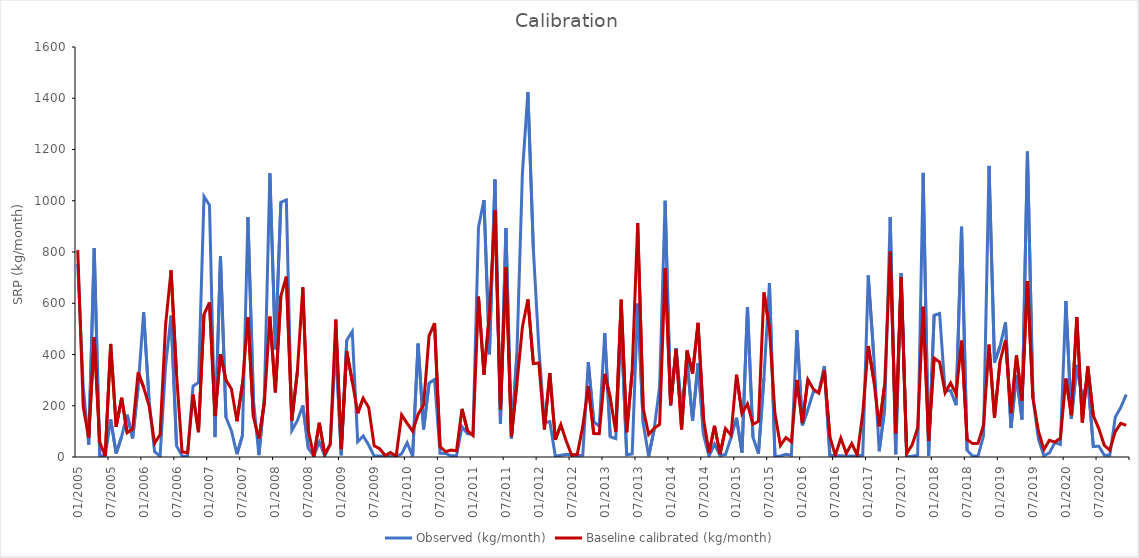
| Category | Observed (kg/month) | Baseline calibrated (kg/month) |
|---|---|---|
| 2005-01-01 | 753.418 | 807.2 |
| 2005-02-01 | 274.582 | 195.3 |
| 2005-03-01 | 48.433 | 75.92 |
| 2005-04-01 | 814.747 | 467.1 |
| 2005-05-01 | 5.586 | 59.03 |
| 2005-06-01 | 4.75 | 4.256 |
| 2005-07-01 | 146.586 | 441.1 |
| 2005-08-01 | 13.657 | 117.8 |
| 2005-09-01 | 80.189 | 230.9 |
| 2005-10-01 | 165.116 | 94.71 |
| 2005-11-01 | 72.857 | 109.1 |
| 2005-12-01 | 272.198 | 330.4 |
| 2006-01-01 | 564.193 | 272 |
| 2006-02-01 | 219.671 | 199.1 |
| 2006-03-01 | 20.928 | 53.64 |
| 2006-04-01 | 3.38 | 87.61 |
| 2006-05-01 | 354.306 | 514.8 |
| 2006-06-01 | 551.727 | 728.5 |
| 2006-07-01 | 43.36 | 320.9 |
| 2006-08-01 | 5.076 | 20.56 |
| 2006-09-01 | 2.96 | 16.75 |
| 2006-10-01 | 276.41 | 243.1 |
| 2006-11-01 | 291.066 | 96.9 |
| 2006-12-01 | 1016.955 | 556.8 |
| 2007-01-01 | 982.65 | 603.1 |
| 2007-02-01 | 77.711 | 159.9 |
| 2007-03-01 | 783.538 | 401.5 |
| 2007-04-01 | 155.234 | 300.7 |
| 2007-05-01 | 102.01 | 265.2 |
| 2007-06-01 | 10.898 | 139.7 |
| 2007-07-01 | 83.407 | 285.6 |
| 2007-08-01 | 936.771 | 546.1 |
| 2007-09-01 | 222.943 | 156 |
| 2007-10-01 | 7.339 | 72.15 |
| 2007-11-01 | 233.2 | 212.2 |
| 2007-12-01 | 1106.851 | 548.2 |
| 2008-01-01 | 420.581 | 252 |
| 2008-02-01 | 994.323 | 628 |
| 2008-03-01 | 1002.733 | 703.9 |
| 2008-04-01 | 103.476 | 142.6 |
| 2008-05-01 | 141.861 | 331.7 |
| 2008-06-01 | 201.143 | 662.1 |
| 2008-07-01 | 33.931 | 103 |
| 2008-08-01 | 2.884 | 3.027 |
| 2008-09-01 | 58.407 | 133.3 |
| 2008-10-01 | 3.25 | 10.74 |
| 2008-11-01 | 52.517 | 48.72 |
| 2008-12-01 | 433.378 | 536.3 |
| 2009-01-01 | 6.941 | 30.63 |
| 2009-02-01 | 455.413 | 412.2 |
| 2009-03-01 | 489.569 | 295.3 |
| 2009-04-01 | 59.773 | 170.4 |
| 2009-05-01 | 82.105 | 229.5 |
| 2009-06-01 | 46.746 | 192.8 |
| 2009-07-01 | 3.439 | 43.92 |
| 2009-08-01 | 4.269 | 32.25 |
| 2009-09-01 | 2.469 | 5.699 |
| 2009-10-01 | 3.131 | 17.43 |
| 2009-11-01 | 2.093 | 2.745 |
| 2009-12-01 | 11.942 | 164.2 |
| 2010-01-01 | 55.731 | 131.1 |
| 2010-02-01 | 2.968 | 100.9 |
| 2010-03-01 | 442.31 | 166.1 |
| 2010-04-01 | 107.638 | 203.9 |
| 2010-05-01 | 287.966 | 472.6 |
| 2010-06-01 | 302.528 | 522.2 |
| 2010-07-01 | 14.729 | 40.54 |
| 2010-08-01 | 14.105 | 20.78 |
| 2010-09-01 | 4.484 | 27.14 |
| 2010-10-01 | 4.926 | 24.54 |
| 2010-11-01 | 117.814 | 187.9 |
| 2010-12-01 | 90.645 | 102.9 |
| 2011-01-01 | 90.034 | 83.78 |
| 2011-02-01 | 897.176 | 625.5 |
| 2011-03-01 | 1003.138 | 321.6 |
| 2011-04-01 | 401.111 | 560.1 |
| 2011-05-01 | 1082.677 | 962.4 |
| 2011-06-01 | 130.043 | 184.9 |
| 2011-07-01 | 892.493 | 741.6 |
| 2011-08-01 | 70.242 | 79.31 |
| 2011-09-01 | 404.987 | 286.9 |
| 2011-10-01 | 1107.212 | 507 |
| 2011-11-01 | 1423.827 | 614.7 |
| 2011-12-01 | 808.576 | 364.2 |
| 2012-01-01 | 423.997 | 366.7 |
| 2012-02-01 | 135.269 | 107.7 |
| 2012-03-01 | 137.536 | 327.5 |
| 2012-04-01 | 2.761 | 67.32 |
| 2012-05-01 | 6.76 | 126.2 |
| 2012-06-01 | 9.333 | 61.75 |
| 2012-07-01 | 9.313 | 5.554 |
| 2012-08-01 | 5.751 | 10.79 |
| 2012-09-01 | 7.133 | 119.6 |
| 2012-10-01 | 370.468 | 275.6 |
| 2012-11-01 | 138.06 | 91.34 |
| 2012-12-01 | 119.799 | 91.13 |
| 2013-01-01 | 483.192 | 324.2 |
| 2013-02-01 | 79.624 | 232.5 |
| 2013-03-01 | 71.896 | 99.16 |
| 2013-04-01 | 512.438 | 613.7 |
| 2013-05-01 | 8.523 | 96.65 |
| 2013-06-01 | 12.122 | 335.1 |
| 2013-07-01 | 598.537 | 913.2 |
| 2013-08-01 | 132.511 | 190.1 |
| 2013-09-01 | 3.376 | 87.68 |
| 2013-10-01 | 106.902 | 112.4 |
| 2013-11-01 | 276.6 | 127.3 |
| 2013-12-01 | 1000.055 | 737.5 |
| 2014-01-01 | 200.336 | 204.9 |
| 2014-02-01 | 425.225 | 418.9 |
| 2014-03-01 | 176.173 | 107.8 |
| 2014-04-01 | 373.378 | 415.7 |
| 2014-05-01 | 141.7 | 325.7 |
| 2014-06-01 | 364.955 | 523.4 |
| 2014-07-01 | 85.646 | 148.4 |
| 2014-08-01 | 3.228 | 16.21 |
| 2014-09-01 | 50.271 | 121.6 |
| 2014-10-01 | 5.616 | 11.41 |
| 2014-11-01 | 10.043 | 110.9 |
| 2014-12-01 | 75.347 | 85.34 |
| 2015-01-01 | 153.159 | 321 |
| 2015-02-01 | 17.15 | 169.6 |
| 2015-03-01 | 584.874 | 206.9 |
| 2015-04-01 | 77.105 | 127.8 |
| 2015-05-01 | 13.039 | 139 |
| 2015-06-01 | 307.394 | 642 |
| 2015-07-01 | 678.588 | 501.8 |
| 2015-08-01 | 3.378 | 170.6 |
| 2015-09-01 | 3.947 | 45.08 |
| 2015-10-01 | 10.464 | 75.83 |
| 2015-11-01 | 6.825 | 59.38 |
| 2015-12-01 | 494.852 | 300.7 |
| 2016-01-01 | 123.581 | 132.4 |
| 2016-02-01 | 185.213 | 302.1 |
| 2016-03-01 | 254.49 | 265 |
| 2016-04-01 | 254.408 | 249.3 |
| 2016-05-01 | 354.893 | 338 |
| 2016-06-01 | 6.306 | 80.61 |
| 2016-07-01 | 5.434 | 5.556 |
| 2016-08-01 | 5.058 | 73.1 |
| 2016-09-01 | 3.491 | 14.37 |
| 2016-10-01 | 3.547 | 52.62 |
| 2016-11-01 | 4.066 | 7.159 |
| 2016-12-01 | 7.46 | 171.9 |
| 2017-01-01 | 708.287 | 432.8 |
| 2017-02-01 | 395.663 | 300.3 |
| 2017-03-01 | 22.487 | 119.6 |
| 2017-04-01 | 188.592 | 284.1 |
| 2017-05-01 | 936.189 | 802.6 |
| 2017-06-01 | 10.627 | 92.95 |
| 2017-07-01 | 717.552 | 700.9 |
| 2017-08-01 | 2.083 | 13.65 |
| 2017-09-01 | 3.382 | 47.42 |
| 2017-10-01 | 6.574 | 113.4 |
| 2017-11-01 | 1108.775 | 586.5 |
| 2017-12-01 | 4.949 | 63.95 |
| 2018-01-01 | 552.769 | 386.5 |
| 2018-02-01 | 560.075 | 370.8 |
| 2018-03-01 | 257.858 | 250.7 |
| 2018-04-01 | 259.439 | 288.7 |
| 2018-05-01 | 202.281 | 247 |
| 2018-06-01 | 898.802 | 453.9 |
| 2018-07-01 | 26.396 | 68.65 |
| 2018-08-01 | 4.211 | 52.38 |
| 2018-09-01 | 3.718 | 53.52 |
| 2018-10-01 | 82.674 | 124.4 |
| 2018-11-01 | 1135.978 | 438.8 |
| 2018-12-01 | 368.529 | 153.3 |
| 2019-01-01 | 431.157 | 371.9 |
| 2019-02-01 | 525.618 | 455.9 |
| 2019-03-01 | 113.068 | 171.3 |
| 2019-04-01 | 318.933 | 396.3 |
| 2019-05-01 | 146.669 | 220.4 |
| 2019-06-01 | 1191.635 | 686.8 |
| 2019-07-01 | 232.313 | 230.4 |
| 2019-08-01 | 69.125 | 100.6 |
| 2019-09-01 | 4.905 | 29.2 |
| 2019-10-01 | 15.813 | 65.45 |
| 2019-11-01 | 56.028 | 58.32 |
| 2019-12-01 | 48.628 | 72.84 |
| 2020-01-01 | 608.698 | 306.2 |
| 2020-02-01 | 148.94 | 163.5 |
| 2020-03-01 | 359.383 | 545.9 |
| 2020-04-01 | 226.817 | 134.7 |
| 2020-05-01 | 301.734 | 353.9 |
| 2020-06-01 | 40.584 | 161.6 |
| 2020-07-01 | 42.209 | 110.8 |
| 2020-08-01 | 6.871 | 45.62 |
| 2020-09-01 | 7.187 | 26.84 |
| 2020-10-01 | 155.37 | 99.21 |
| 2020-11-01 | 193.516 | 131 |
| 2020-12-01 | 243.785 | 123.1 |